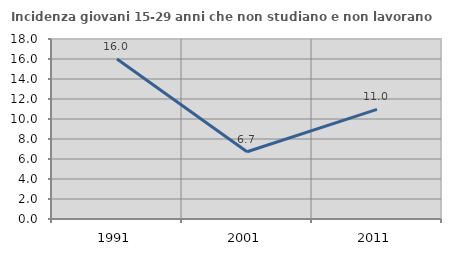
| Category | Incidenza giovani 15-29 anni che non studiano e non lavorano  |
|---|---|
| 1991.0 | 16.009 |
| 2001.0 | 6.721 |
| 2011.0 | 10.962 |